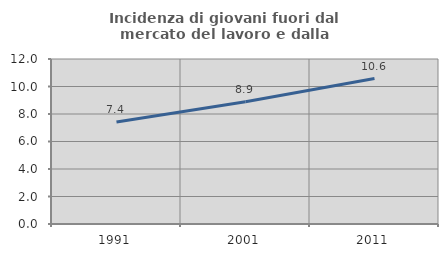
| Category | Incidenza di giovani fuori dal mercato del lavoro e dalla formazione  |
|---|---|
| 1991.0 | 7.424 |
| 2001.0 | 8.895 |
| 2011.0 | 10.577 |